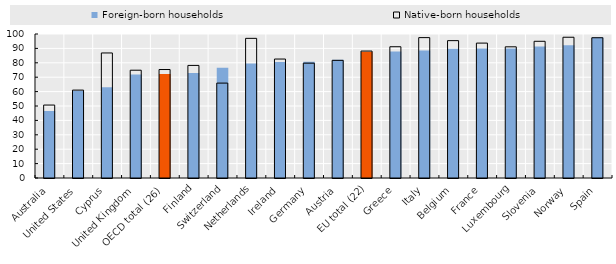
| Category | Foreign-born households | Native-born households |
|---|---|---|
| Australia | 46.521 | 50.652 |
| United States | 60.58 | 61.04 |
| Cyprus | 62.994 | 86.828 |
| United Kingdom | 71.894 | 74.851 |
| OECD total (26) | 72.243 | 75.328 |
| Finland | 72.841 | 78.184 |
| Switzerland | 76.561 | 65.906 |
| Netherlands | 79.439 | 96.974 |
| Ireland | 80.532 | 82.606 |
| Germany | 80.78 | 79.743 |
| Austria | 82.078 | 81.702 |
| EU total (22) | 87.605 | 88.158 |
| Greece | 87.85 | 91.149 |
| Italy | 88.605 | 97.483 |
| Belgium | 89.806 | 95.394 |
| France | 89.942 | 93.676 |
| Luxembourg | 89.97 | 91.1 |
| Slovenia | 91.238 | 94.936 |
| Norway | 92.25 | 97.75 |
| Spain | 97.698 | 97.401 |